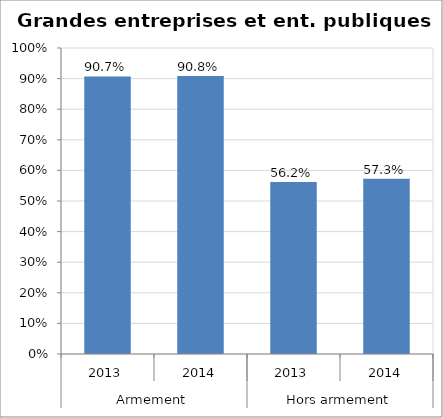
| Category | Part des Grandes Entreprises et Ent. Publiques dans les paiements aux entreprises |
|---|---|
| 0 | 0.907 |
| 1 | 0.908 |
| 2 | 0.562 |
| 3 | 0.573 |